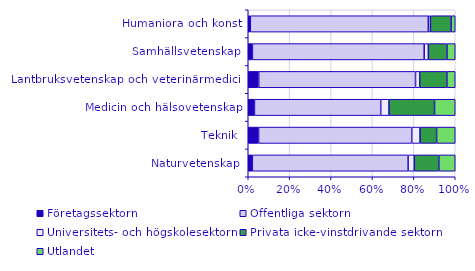
| Category | Företagssektorn | Offentliga sektorn | Universitets- och högskolesektorn | Privata icke-vinstdrivande sektorn | Utlandet |
|---|---|---|---|---|---|
| Naturvetenskap | 0.02 | 0.76 | 0.03 | 0.12 | 0.08 |
| Teknik | 0.05 | 0.74 | 0.04 | 0.08 | 0.09 |
| Medicin och hälsovetenskap | 0.03 | 0.61 | 0.04 | 0.22 | 0.1 |
| Lantbruksvetenskap och veterinärmedicin | 0.05 | 0.75 | 0.02 | 0.13 | 0.04 |
| Samhällsvetenskap | 0.02 | 0.83 | 0.02 | 0.09 | 0.04 |
| Humaniora och konst | 0.01 | 0.86 | 0.01 | 0.1 | 0.02 |